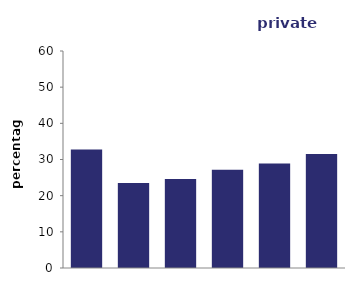
| Category | private renters |
|---|---|
| 16-24 | 32.775 |
| 25-34 | 23.513 |
| 35-44 | 24.591 |
| 45-54 | 27.138 |
| 55-64 | 28.87 |
| 65 
or over | 31.534 |